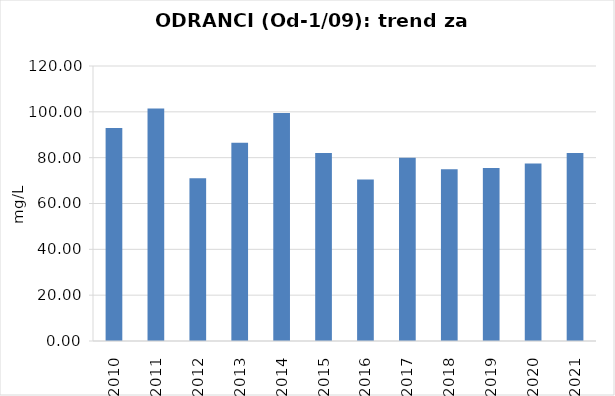
| Category | Vsota |
|---|---|
| 2010 | 93 |
| 2011 | 101.5 |
| 2012 | 71 |
| 2013 | 86.5 |
| 2014 | 99.5 |
| 2015 | 82 |
| 2016 | 70.5 |
| 2017 | 80 |
| 2018 | 75 |
| 2019 | 75.5 |
| 2020 | 77.5 |
| 2021 | 82 |